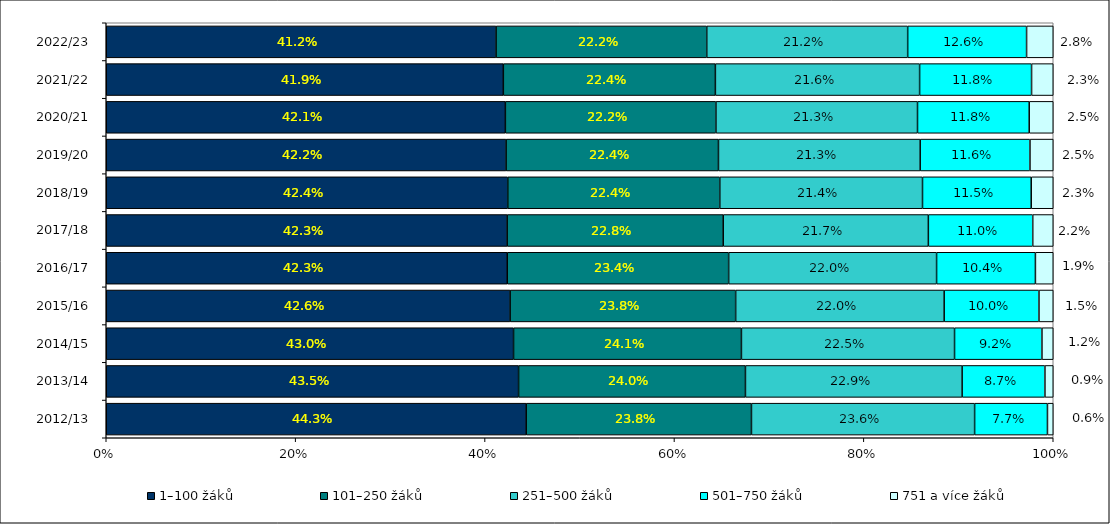
| Category | 1–100 žáků | 101–250 žáků | 251–500 žáků | 501–750 žáků | 751 a více žáků |
|---|---|---|---|---|---|
| 2012/13 | 0.443 | 0.238 | 0.236 | 0.077 | 0.006 |
| 2013/14 | 0.435 | 0.24 | 0.229 | 0.087 | 0.009 |
| 2014/15 | 0.43 | 0.241 | 0.225 | 0.092 | 0.012 |
| 2015/16 | 0.426 | 0.238 | 0.22 | 0.1 | 0.015 |
| 2016/17 | 0.423 | 0.234 | 0.22 | 0.104 | 0.019 |
| 2017/18 | 0.423 | 0.228 | 0.217 | 0.11 | 0.022 |
| 2018/19 | 0.424 | 0.224 | 0.214 | 0.115 | 0.023 |
| 2019/20 | 0.422 | 0.224 | 0.213 | 0.116 | 0.025 |
| 2020/21 | 0.421 | 0.222 | 0.213 | 0.118 | 0.025 |
| 2021/22 | 0.419 | 0.224 | 0.216 | 0.118 | 0.023 |
| 2022/23 | 0.412 | 0.222 | 0.212 | 0.126 | 0.028 |